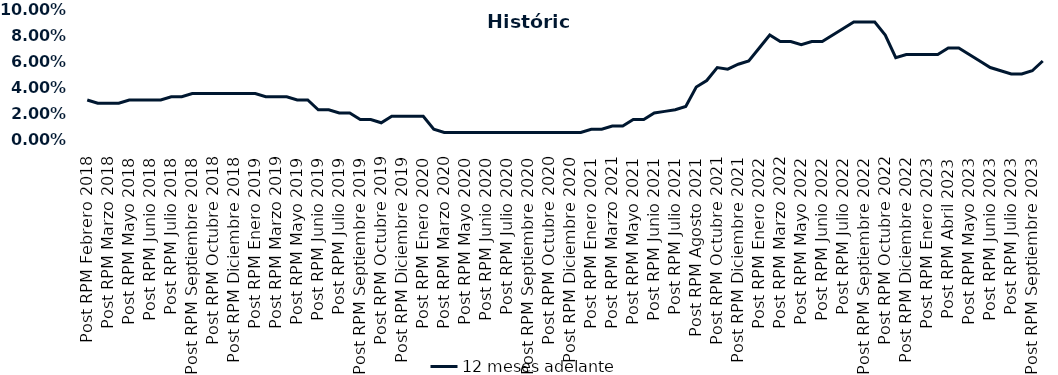
| Category | 12 meses adelante  |
|---|---|
| Post RPM Febrero 2018 | 0.03 |
| Pre RPM Marzo 2018 | 0.028 |
| Post RPM Marzo 2018 | 0.028 |
| Pre RPM Mayo 2018 | 0.028 |
| Post RPM Mayo 2018 | 0.03 |
| Pre RPM Junio 2018 | 0.03 |
| Post RPM Junio 2018 | 0.03 |
| Pre RPM Julio 2018 | 0.03 |
| Post RPM Julio 2018 | 0.032 |
| Pre RPM Septiembre 2018 | 0.032 |
| Post RPM Septiembre 2018 | 0.035 |
| Pre RPM Octubre 2018 | 0.035 |
| Post RPM Octubre 2018 | 0.035 |
| Pre RPM Diciembre 2018 | 0.035 |
| Post RPM Diciembre 2018 | 0.035 |
| Pre RPM Enero 2019 | 0.035 |
| Post RPM Enero 2019 | 0.035 |
| Pre RPM Marzo 2019 | 0.032 |
| Post RPM Marzo 2019 | 0.032 |
| Pre RPM Mayo 2019 | 0.032 |
| Post RPM Mayo 2019 | 0.03 |
| Pre RPM Junio 2019 | 0.03 |
| Post RPM Junio 2019 | 0.022 |
| Pre RPM Julio 2019 | 0.022 |
| Post RPM Julio 2019 | 0.02 |
| Pre RPM Septiembre 2019 | 0.02 |
| Post RPM Septiembre 2019 | 0.015 |
| Pre RPM Octubre 2019 | 0.015 |
| Post RPM Octubre 2019 | 0.012 |
| Pre RPM Diciembre 2019 | 0.018 |
| Post RPM Diciembre 2019 | 0.018 |
| Pre RPM Enero 2020 | 0.018 |
| Post RPM Enero 2020 | 0.018 |
| Pre RPM Marzo 2020 | 0.008 |
| Post RPM Marzo 2020 | 0.005 |
| Pre RPM Mayo 2020 | 0.005 |
| Post RPM Mayo 2020 | 0.005 |
| Pre RPM Junio 2020 | 0.005 |
| Post RPM Junio 2020 | 0.005 |
| Pre RPM Julio 2020 | 0.005 |
| Post RPM Julio 2020 | 0.005 |
| Pre RPM Septiembre 2020 | 0.005 |
| Post RPM Septiembre 2020 | 0.005 |
| Pre RPM Octubre 2020 | 0.005 |
| Post RPM Octubre 2020 | 0.005 |
| Pre RPM Diciembre 2020 | 0.005 |
| Post RPM Diciembre 2020 | 0.005 |
| Pre RPM Enero 2021 | 0.005 |
| Post RPM Enero 2021 | 0.008 |
| Pre RPM Marzo 2021 | 0.008 |
| Post RPM Marzo 2021 | 0.01 |
| Pre RPM Mayo 2021 | 0.01 |
| Post RPM Mayo 2021 | 0.015 |
| Pre RPM Junio 2021 | 0.015 |
| Post RPM Junio 2021 | 0.02 |
| Pre RPM Julio 2021 | 0.021 |
| Post RPM Julio 2021 | 0.022 |
| Pre RPM Agosto 2021 | 0.025 |
| Post RPM Agosto 2021 | 0.04 |
| Pre RPM Octubre 2021 | 0.045 |
| Post RPM Octubre 2021 | 0.055 |
| Pre RPM Diciembre 2021 | 0.054 |
| Post RPM Diciembre 2021 | 0.058 |
| Pre RPM Enero 2022 | 0.06 |
| Post RPM Enero 2022 | 0.07 |
| Pre RPM Marzo 2022 | 0.08 |
| Post RPM Marzo 2022 | 0.075 |
| Pre RPM Mayo 2022 | 0.075 |
| Post RPM Mayo 2022 | 0.072 |
| Pre RPM Junio 2022 | 0.075 |
| Post RPM Junio 2022 | 0.075 |
| Pre RPM Julio 2022 | 0.08 |
| Post RPM Julio 2022 | 0.085 |
| Pre RPM Septiembre 2022 | 0.09 |
| Post RPM Septiembre 2022 | 0.09 |
| Pre RPM Octubre 2022 | 0.09 |
| Post RPM Octubre 2022 | 0.08 |
| Pre RPM Diciembre 2022 | 0.062 |
| Post RPM Diciembre 2022 | 0.065 |
| Pre RPM Enero 2023 | 0.065 |
| Post RPM Enero 2023 | 0.065 |
| Pre RPM Abril 2023 | 0.065 |
| Post RPM Abril 2023 | 0.07 |
| Pre RPM Mayo 2023 | 0.07 |
| Post RPM Mayo 2023 | 0.065 |
| Pre RPM Junio 2023 | 0.06 |
| Post RPM Junio 2023 | 0.055 |
| Pre RPM Julio 2023 | 0.052 |
| Post RPM Julio 2023 | 0.05 |
| Pre RPM Septiembre 2023 | 0.05 |
| Post RPM Septiembre 2023 | 0.052 |
| Pre RPM Octubre 2023 | 0.06 |